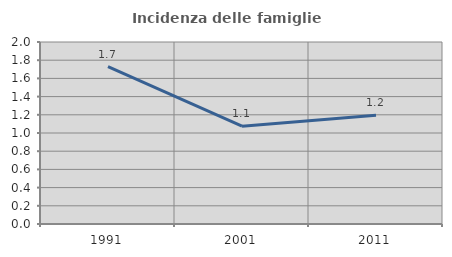
| Category | Incidenza delle famiglie numerose |
|---|---|
| 1991.0 | 1.728 |
| 2001.0 | 1.075 |
| 2011.0 | 1.196 |